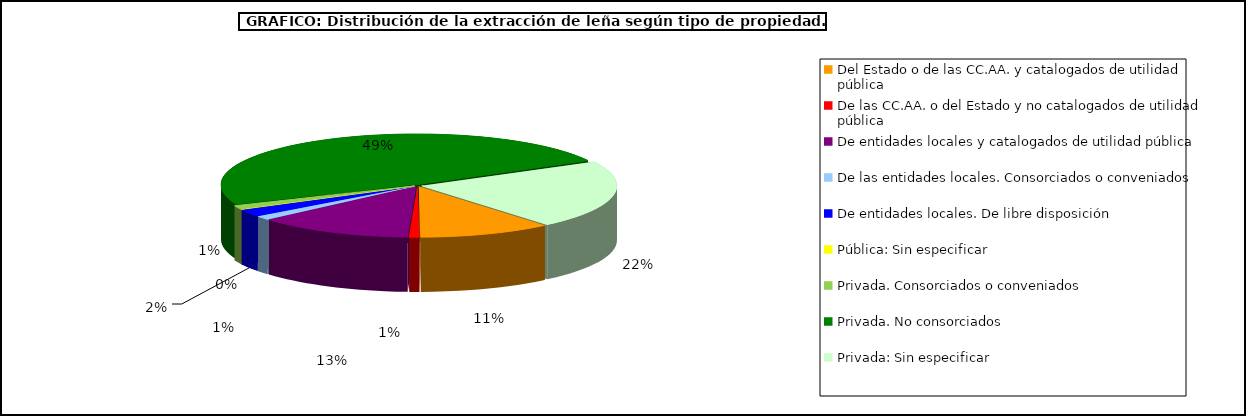
| Category | Series 0 |
|---|---|
| Del Estado o de las CC.AA. y catalogados de utilidad pública | 202105.31 |
| De las CC.AA. o del Estado y no catalogados de utilidad pública | 15236.35 |
| De entidades locales y catalogados de utilidad pública | 237147.43 |
| De las entidades locales. Consorciados o conveniados | 23033.8 |
| De entidades locales. De libre disposición | 45615.43 |
| Pública: Sin especificar | 927 |
| Privada. Consorciados o conveniados | 22752.5 |
| Privada. No consorciados | 892409.59 |
| Privada: Sin especificar | 400752.84 |